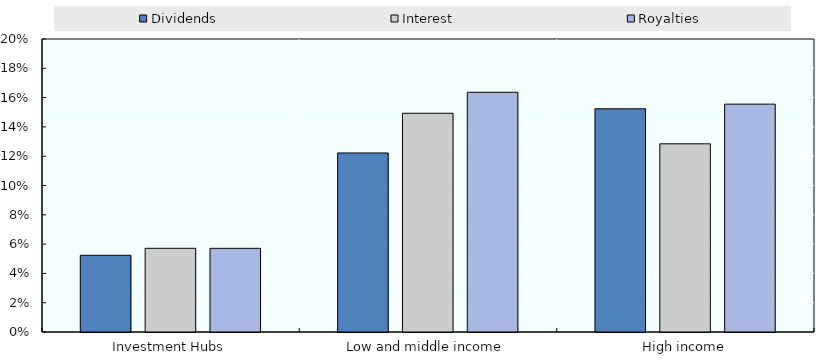
| Category | Dividends | Interest | Royalties |
|---|---|---|---|
| Investment Hubs | 0.052 | 0.057 | 0.057 |
| Low and middle income | 0.122 | 0.149 | 0.164 |
| High income | 0.152 | 0.128 | 0.156 |